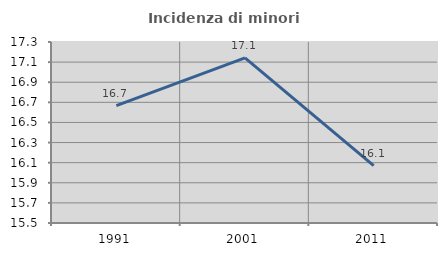
| Category | Incidenza di minori stranieri |
|---|---|
| 1991.0 | 16.667 |
| 2001.0 | 17.143 |
| 2011.0 | 16.071 |